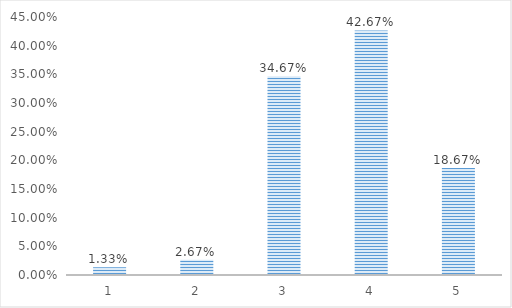
| Category | Series 0 |
|---|---|
| 1.0 | 0.013 |
| 2.0 | 0.027 |
| 3.0 | 0.347 |
| 4.0 | 0.427 |
| 5.0 | 0.187 |